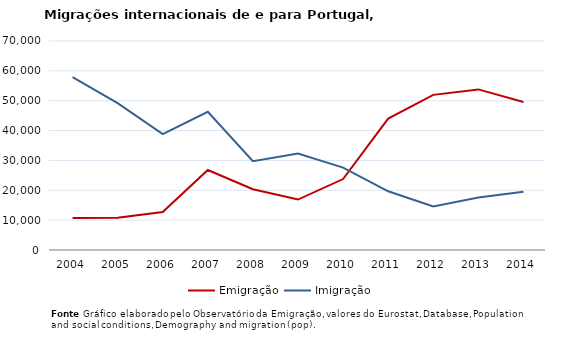
| Category | Emigração | Imigração |
|---|---|---|
| 2004.0 | 10680 | 57920 |
| 2005.0 | 10800 | 49200 |
| 2006.0 | 12700 | 38800 |
| 2007.0 | 26800 | 46300 |
| 2008.0 | 20357 | 29718 |
| 2009.0 | 16899 | 32307 |
| 2010.0 | 23760 | 27575 |
| 2011.0 | 43998 | 19667 |
| 2012.0 | 51958 | 14606 |
| 2013.0 | 53786 | 17554 |
| 2014.0 | 49572 | 19516 |